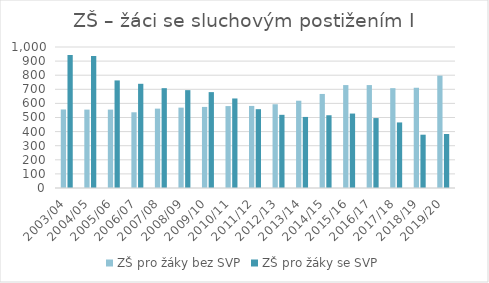
| Category | ZŠ pro žáky bez SVP | ZŠ pro žáky se SVP |
|---|---|---|
| 2003/04 | 557 | 944 |
| 2004/05 | 556 | 937 |
| 2005/06 | 556 | 763 |
| 2006/07 | 537 | 739 |
| 2007/08 | 563 | 708 |
| 2008/09 | 570 | 694 |
| 2009/10 | 575 | 680 |
| 2010/11 | 581 | 635 |
| 2011/12 | 582 | 559 |
| 2012/13 | 594 | 519 |
| 2013/14 | 619 | 504 |
| 2014/15 | 667 | 516 |
| 2015/16 | 730 | 528 |
| 2016/17 | 730 | 496 |
| 2017/18 | 708 | 465 |
| 2018/19 | 711 | 378 |
| 2019/20 | 797 | 383 |